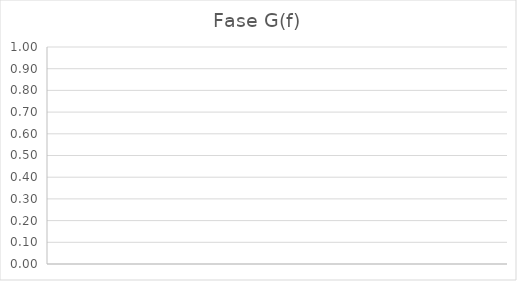
| Category | Fase G(f) |
|---|---|
|  | 0 |
|  | 0 |
|  | 0 |
|  | 0 |
|  | 0 |
|  | 0 |
|  | 0 |
|  | 0 |
|  | 0 |
|  | 0 |
|  | 0 |
|  | 0 |
|  | 0 |
|  | 0 |
|  | 0 |
|  | 0 |
|  | 0 |
|  | 0 |